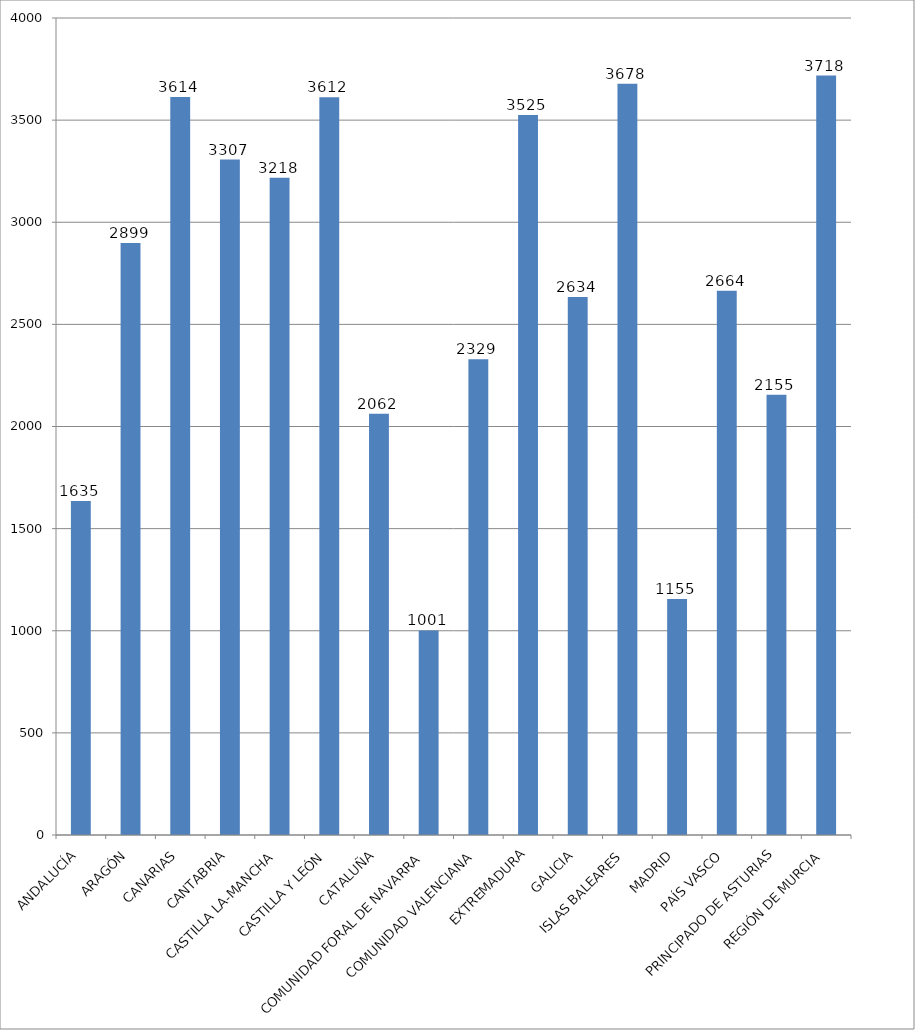
| Category | Total |
|---|---|
| ANDALUCÍA | 1635.2 |
| ARAGÓN | 2899 |
| CANARIAS | 3613.5 |
| CANTABRIA | 3307 |
| CASTILLA LA-MANCHA | 3217.5 |
| CASTILLA Y LEÓN | 3612.4 |
| CATALUÑA | 2062.381 |
| COMUNIDAD FORAL DE NAVARRA | 1001.333 |
| COMUNIDAD VALENCIANA | 2329.2 |
| EXTREMADURA | 3524.5 |
| GALICIA | 2633.8 |
| ISLAS BALEARES | 3678 |
| MADRID | 1155.455 |
| PAÍS VASCO | 2664.4 |
| PRINCIPADO DE ASTURIAS | 2155 |
| REGIÓN DE MURCIA | 3718 |